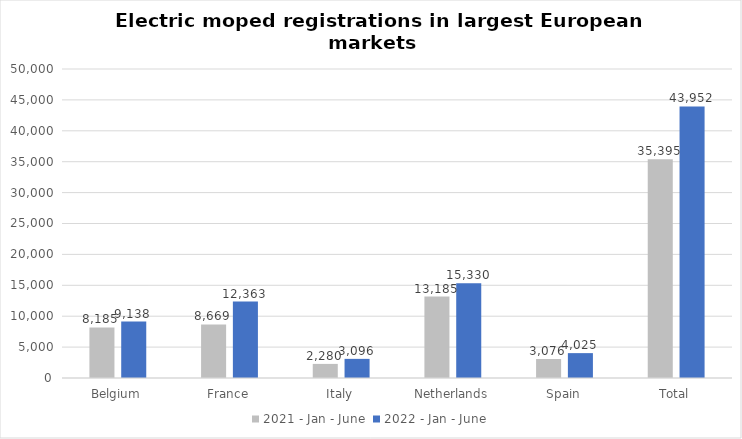
| Category | 2021 - Jan - June | 2022 - Jan - June |
|---|---|---|
| Belgium | 8185 | 9138 |
| France | 8669 | 12363 |
| Italy | 2280 | 3096 |
| Netherlands | 13185 | 15330 |
| Spain | 3076 | 4025 |
| Total | 35395 | 43952 |